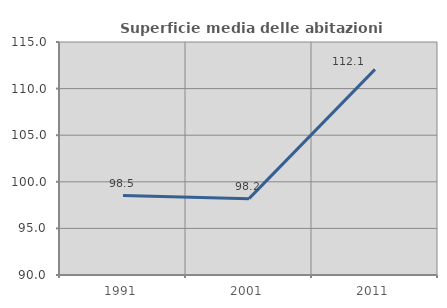
| Category | Superficie media delle abitazioni occupate |
|---|---|
| 1991.0 | 98.519 |
| 2001.0 | 98.195 |
| 2011.0 | 112.06 |